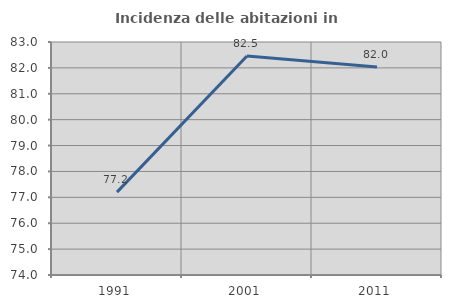
| Category | Incidenza delle abitazioni in proprietà  |
|---|---|
| 1991.0 | 77.202 |
| 2001.0 | 82.462 |
| 2011.0 | 82.038 |